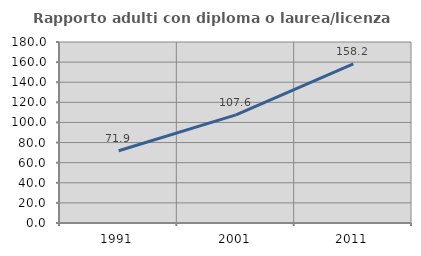
| Category | Rapporto adulti con diploma o laurea/licenza media  |
|---|---|
| 1991.0 | 71.907 |
| 2001.0 | 107.566 |
| 2011.0 | 158.208 |